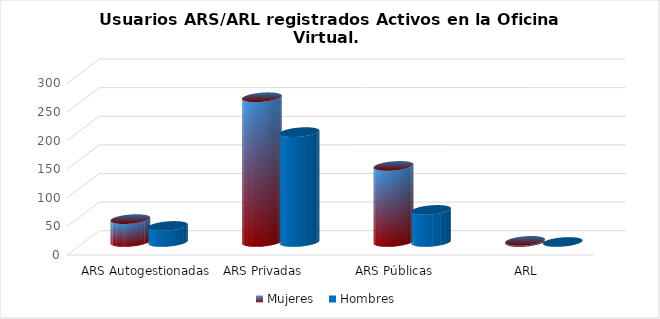
| Category | Mujeres | Hombres |
|---|---|---|
| ARS Autogestionadas | 40 | 28 |
| ARS Privadas | 253 | 192 |
| ARS Públicas | 133 | 56 |
| ARL | 2 | 0 |